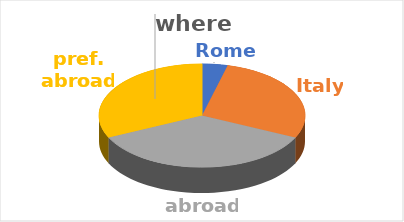
| Category | where | Series 1 | Series 2 | Series 3 | Series 4 |
|---|---|---|---|---|---|
| Rome | 0.04 |  |  |  |  |
| Italy | 0.28 |  |  |  |  |
| abroad | 0.36 |  |  |  |  |
| pref. abroad | 0.32 |  |  |  |  |